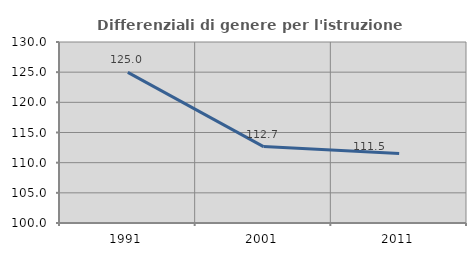
| Category | Differenziali di genere per l'istruzione superiore |
|---|---|
| 1991.0 | 124.965 |
| 2001.0 | 112.667 |
| 2011.0 | 111.5 |